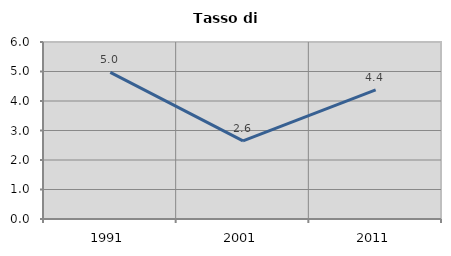
| Category | Tasso di disoccupazione   |
|---|---|
| 1991.0 | 4.972 |
| 2001.0 | 2.649 |
| 2011.0 | 4.375 |